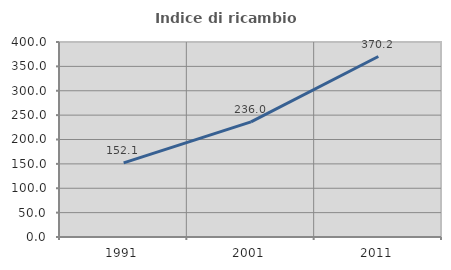
| Category | Indice di ricambio occupazionale  |
|---|---|
| 1991.0 | 152.075 |
| 2001.0 | 236.034 |
| 2011.0 | 370.182 |